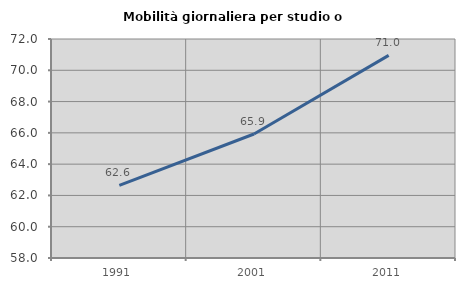
| Category | Mobilità giornaliera per studio o lavoro |
|---|---|
| 1991.0 | 62.637 |
| 2001.0 | 65.926 |
| 2011.0 | 70.952 |